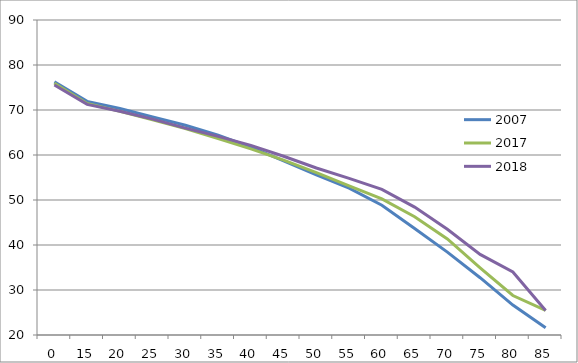
| Category | 2007 | 2017 | 2018 |
|---|---|---|---|
| 0.0 | 76.25 | 75.961 | 75.566 |
| 15.0 | 71.92 | 71.451 | 71.256 |
| 20.0 | 70.32 | 69.702 | 69.711 |
| 25.0 | 68.47 | 67.802 | 67.982 |
| 30.0 | 66.62 | 65.888 | 65.98 |
| 35.0 | 64.4 | 63.656 | 64.132 |
| 40.0 | 61.76 | 61.36 | 62.128 |
| 45.0 | 58.72 | 58.862 | 59.726 |
| 50.0 | 55.58 | 56.104 | 57.103 |
| 55.0 | 52.62 | 53.144 | 54.798 |
| 60.0 | 48.83 | 50.24 | 52.376 |
| 65.0 | 43.68 | 46.283 | 48.426 |
| 70.0 | 38.42 | 41.334 | 43.499 |
| 75.0 | 32.73 | 34.921 | 37.917 |
| 80.0 | 26.66 | 28.777 | 34.006 |
| 85.0 | 21.6 | 25.487 | 25.465 |